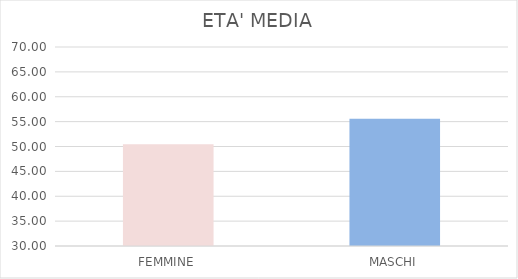
| Category | MEDIA |
|---|---|
| FEMMINE | 50.435 |
| MASCHI | 55.564 |